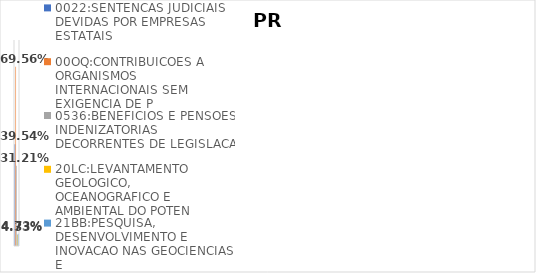
| Category | 0022:SENTENCAS JUDICIAIS DEVIDAS POR EMPRESAS ESTATAIS | 00OQ:CONTRIBUICOES A ORGANISMOS INTERNACIONAIS SEM EXIGENCIA DE P | 0536:BENEFICIOS E PENSOES INDENIZATORIAS DECORRENTES DE LEGISLACA | 20LC:LEVANTAMENTO GEOLOGICO, OCEANOGRAFICO E AMBIENTAL DO POTEN | 21BB:PESQUISA, DESENVOLVIMENTO E INOVACAO NAS GEOCIENCIAS E |
|---|---|---|---|---|---|
| EXECUTADO | 0.395 | 0.696 | 0.312 | 0.043 | 0.047 |